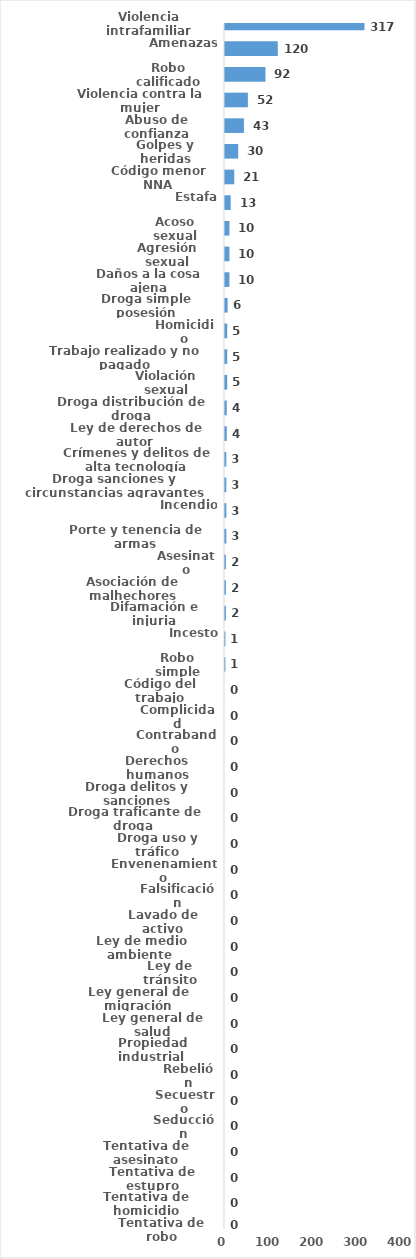
| Category | Series 0 |
|---|---|
| Violencia intrafamiliar | 317 |
| Amenazas | 120 |
| Robo calificado | 92 |
| Violencia contra la mujer | 52 |
| Abuso de confianza | 43 |
| Golpes y heridas | 30 |
| Código menor NNA | 21 |
| Estafa | 13 |
| Acoso sexual | 10 |
| Agresión sexual | 10 |
| Daños a la cosa ajena | 10 |
| Droga simple posesión | 6 |
| Homicidio | 5 |
| Trabajo realizado y no pagado | 5 |
| Violación sexual | 5 |
| Droga distribución de droga | 4 |
| Ley de derechos de autor  | 4 |
| Crímenes y delitos de alta tecnología | 3 |
| Droga sanciones y circunstancias agravantes | 3 |
| Incendio | 3 |
| Porte y tenencia de armas | 3 |
| Asesinato | 2 |
| Asociación de malhechores | 2 |
| Difamación e injuria | 2 |
| Incesto | 1 |
| Robo simple | 1 |
| Código del trabajo | 0 |
| Complicidad | 0 |
| Contrabando | 0 |
| Derechos humanos | 0 |
| Droga delitos y sanciones | 0 |
| Droga traficante de droga  | 0 |
| Droga uso y tráfico | 0 |
| Envenenamiento | 0 |
| Falsificación | 0 |
| Lavado de activo | 0 |
| Ley de medio ambiente  | 0 |
| Ley de tránsito | 0 |
| Ley general de migración | 0 |
| Ley general de salud | 0 |
| Propiedad industrial  | 0 |
| Rebelión | 0 |
| Secuestro | 0 |
| Seducción | 0 |
| Tentativa de asesinato | 0 |
| Tentativa de estupro | 0 |
| Tentativa de homicidio | 0 |
| Tentativa de robo | 0 |